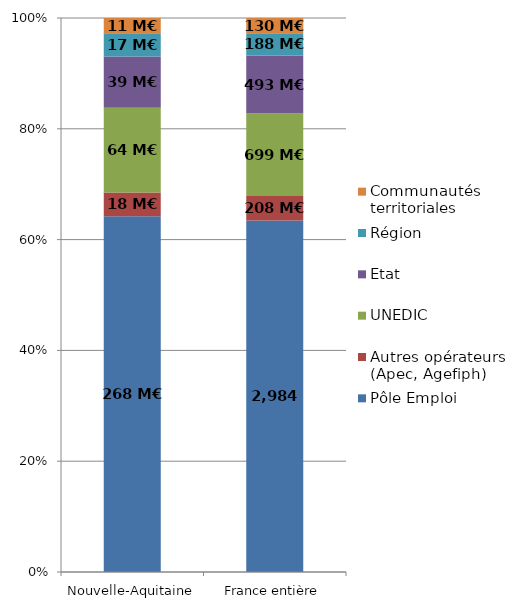
| Category | Pôle Emploi | Autres opérateurs (Apec, Agefiph) | UNEDIC | Etat | Région | Communautés territoriales |
|---|---|---|---|---|---|---|
| Nouvelle-Aquitaine | 267.876 | 17.914 | 63.797 | 38.629 | 17.433 | 11.471 |
| France entière | 2983.694 | 207.577 | 699.479 | 493.308 | 188.079 | 129.71 |